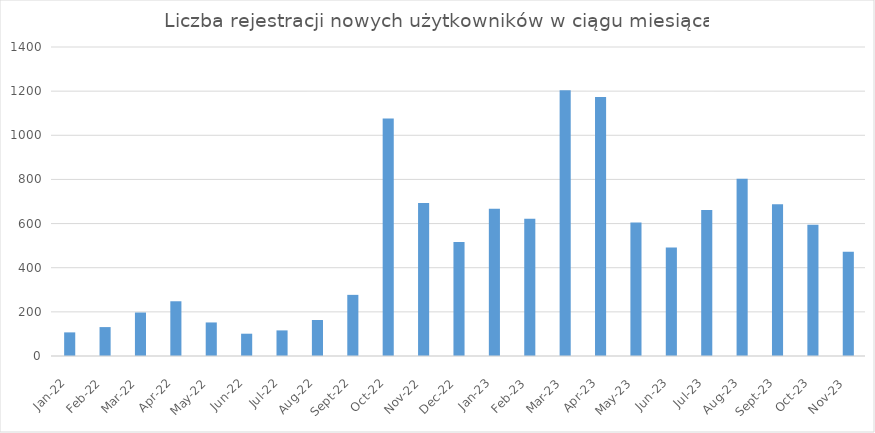
| Category | Series 0 |
|---|---|
| 2022-01-01 | 107 |
| 2022-02-01 | 131 |
| 2022-03-01 | 197 |
| 2022-04-01 | 248 |
| 2022-05-01 | 152 |
| 2022-06-01 | 101 |
| 2022-07-01 | 116 |
| 2022-08-01 | 163 |
| 2022-09-01 | 277 |
| 2022-10-01 | 1076 |
| 2022-11-01 | 693 |
| 2022-12-01 | 517 |
| 2023-01-01 | 667 |
| 2023-02-01 | 622 |
| 2023-03-01 | 1204 |
| 2023-04-01 | 1173 |
| 2023-05-01 | 605 |
| 2023-06-01 | 492 |
| 2023-07-01 | 662 |
| 2023-08-01 | 803 |
| 2023-09-01 | 688 |
| 2023-10-01 | 595 |
| 2023-11-01 | 472 |